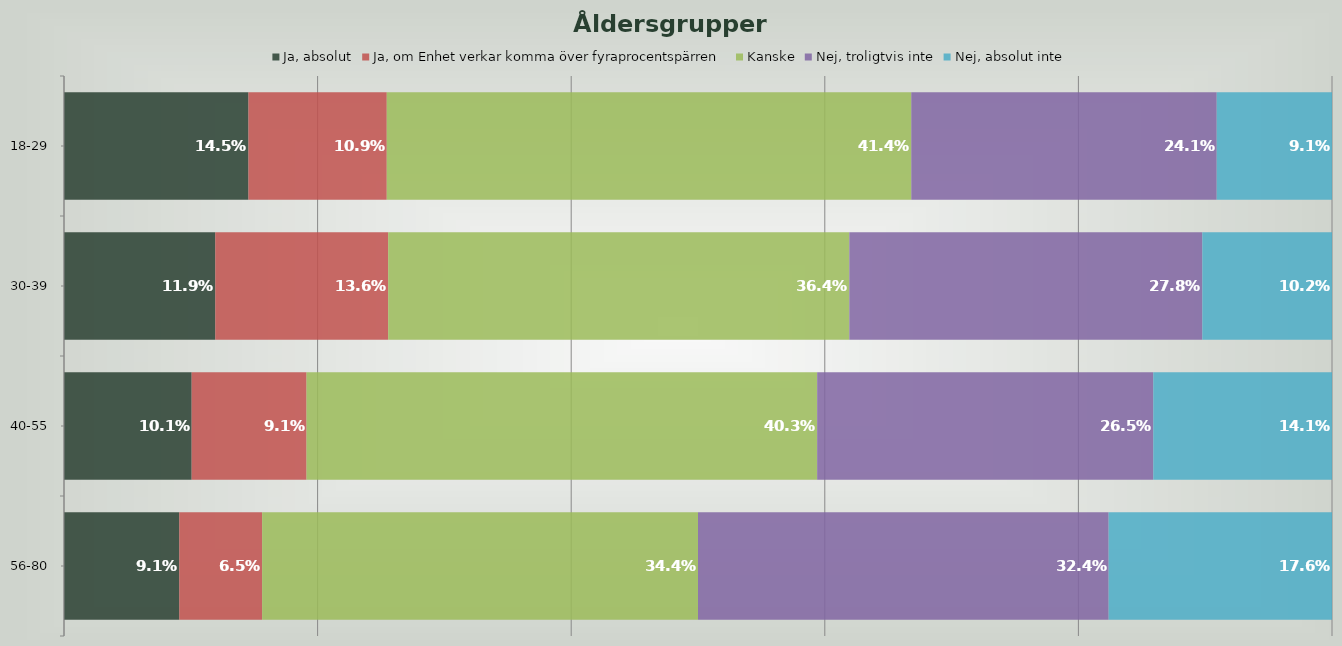
| Category | Ja, absolut | Ja, om Enhet verkar komma över fyraprocentspärren | Kanske | Nej, troligtvis inte | Nej, absolut inte |
|---|---|---|---|---|---|
| 18-29 | 0.145 | 0.109 | 0.414 | 0.241 | 0.091 |
| 30-39 | 0.119 | 0.136 | 0.364 | 0.278 | 0.102 |
| 40-55 | 0.101 | 0.091 | 0.403 | 0.265 | 0.141 |
| 56-80 | 0.091 | 0.065 | 0.344 | 0.324 | 0.176 |